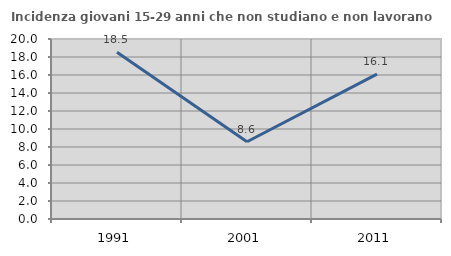
| Category | Incidenza giovani 15-29 anni che non studiano e non lavorano  |
|---|---|
| 1991.0 | 18.519 |
| 2001.0 | 8.586 |
| 2011.0 | 16.103 |